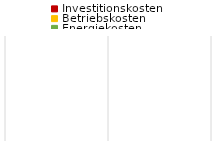
| Category | Investitionskosten | Betriebskosten | Energiekosten |
|---|---|---|---|
| 1 | Bitte wählen… | 0 | 0 | 0 |
| 2 | Pelletsanlage | 0 | 0 | 0 |
| 3 | Nah- /Fernwärme (ern.) | 0 | 0 | 0 |
| 4 | Wärmepumpe (Luft) | 0 | 0 | 0 |
| 5 | Wärmepumpe (Wasser) | 0 | 0 | 0 |
| 6 | Wärmepumpe (Sole) | 0 | 0 | 0 |